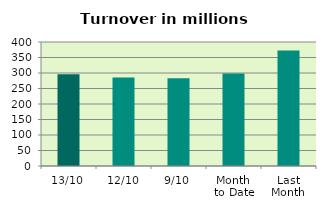
| Category | Series 0 |
|---|---|
| 13/10 | 296.332 |
| 12/10 | 285.558 |
| 9/10 | 282.851 |
| Month 
to Date | 298.311 |
| Last
Month | 372.713 |